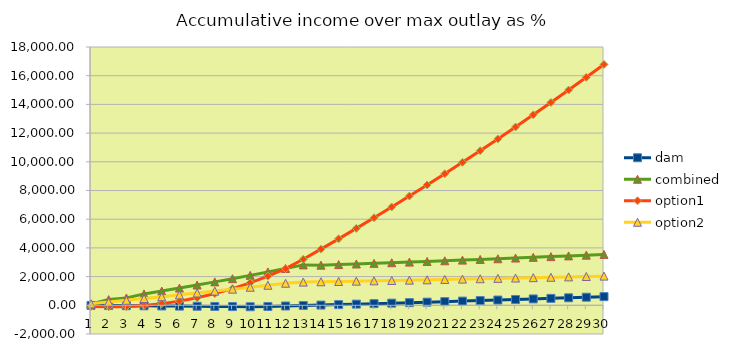
| Category | dam | combined | option1 | option2 |
|---|---|---|---|---|
| 0 | -8.738 | 100 | -77.248 | 100 |
| 1 | -17.739 | 398.24 | -100 | 222.572 |
| 2 | -27.011 | 513.055 | -94.366 | 346.667 |
| 3 | -36.559 | 794.774 | -16.818 | 472.307 |
| 4 | -46.389 | 995.018 | 111.36 | 599.515 |
| 5 | -56.508 | 1201.109 | 291.67 | 728.316 |
| 6 | -66.921 | 1413.178 | 525.647 | 858.732 |
| 7 | -77.637 | 1631.358 | 814.859 | 990.789 |
| 8 | -88.661 | 1855.784 | 1160.913 | 1124.51 |
| 9 | -100 | 2086.594 | 1565.447 | 1259.921 |
| 10 | -80.393 | 2323.93 | 2030.139 | 1397.047 |
| 11 | -48.983 | 2567.935 | 2556.702 | 1535.914 |
| 12 | -17.102 | 2815.095 | 3207.384 | 1617.084 |
| 13 | 15.258 | 2795.442 | 3914.384 | 1638.793 |
| 14 | 48.103 | 2837.374 | 4631.99 | 1660.827 |
| 15 | 81.44 | 2879.935 | 5360.36 | 1683.192 |
| 16 | 115.278 | 2923.134 | 6099.655 | 1705.893 |
| 17 | 149.623 | 2966.981 | 6850.04 | 1728.934 |
| 18 | 184.483 | 3011.485 | 7611.681 | 1752.321 |
| 19 | 219.866 | 3056.658 | 8384.746 | 1776.059 |
| 20 | 255.78 | 3102.508 | 9169.407 | 1800.152 |
| 21 | 292.233 | 3149.045 | 9965.838 | 1824.607 |
| 22 | 329.233 | 3196.281 | 10774.216 | 1849.429 |
| 23 | 366.787 | 3244.225 | 11594.719 | 1874.623 |
| 24 | 404.905 | 3292.888 | 12427.53 | 1900.196 |
| 25 | 443.595 | 3342.282 | 13272.833 | 1926.151 |
| 26 | 482.864 | 3392.416 | 14130.815 | 1952.496 |
| 27 | 522.723 | 3443.302 | 15001.667 | 1979.237 |
| 28 | 563.18 | 3494.952 | 15885.582 | 2006.378 |
| 29 | 604.244 | 3547.376 | 16782.756 | 2033.926 |